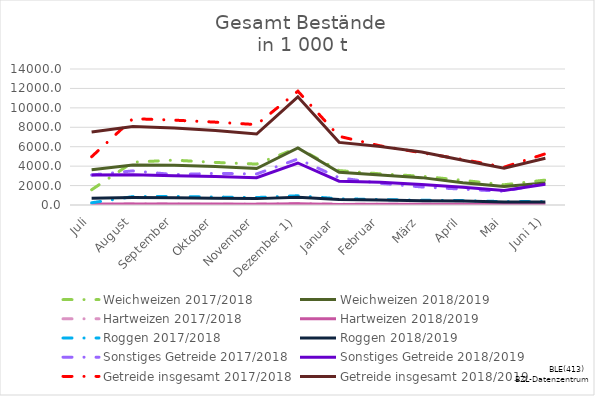
| Category | Weichweizen | Hartweizen | Roggen | Sonstiges Getreide | Getreide insgesamt |
|---|---|---|---|---|---|
| Juli | 3625.885 | 99.552 | 703.26 | 3089.929 | 7518.626 |
| August | 4107.77 | 92.916 | 766.352 | 3117.695 | 8084.732 |
| September | 4091.229 | 90.5 | 737.118 | 3006.611 | 7925.458 |
| Oktober | 3956.193 | 91.884 | 693.535 | 2921.482 | 7663.094 |
| November | 3749.172 | 87.304 | 656.346 | 2814.037 | 7306.859 |
| Dezember 1) | 5872.836 | 130.461 | 806.234 | 4323.716 | 11133.246 |
| Januar  | 3376.178 | 53.315 | 565.177 | 2452.541 | 6447.21 |
| Februar | 3079.774 | 83.214 | 514.929 | 2336.829 | 6014.745 |
| März | 2817.596 | 80.911 | 449.117 | 2107.419 | 5455.044 |
| April | 2298.545 | 75.325 | 399.896 | 1832.455 | 4606.221 |
| Mai | 1914.41 | 64.971 | 308.726 | 1497.587 | 3785.693 |
| Juni 1) | 2268.003 | 102.056 | 309.149 | 2132.721 | 4811.93 |